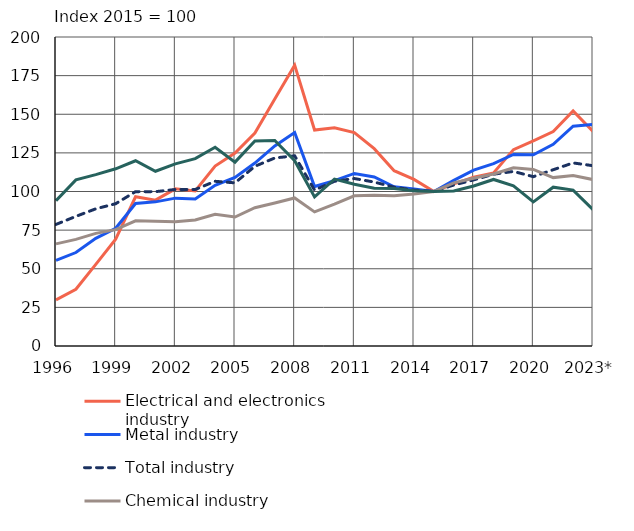
| Category | Electrical and electronics industry | Metal industry | Total industry | Chemical industry  | Forest industry |
|---|---|---|---|---|---|
| 1996 | 29.9 | 55.4 | 78.7 | 66.1 | 94.1 |
| 1997 | 36.7 | 60.5 | 83.9 | 69 | 107.5 |
| 1998 | 52.8 | 69.7 | 88.8 | 72.9 | 110.9 |
| 1999 | 69.2 | 76.2 | 92.1 | 75.3 | 114.7 |
| 2000 | 96.6 | 92.2 | 99.9 | 81 | 119.9 |
| 2001 | 94.4 | 93.3 | 99.9 | 80.7 | 113.1 |
| 2002 | 101.7 | 95.7 | 101.3 | 80.4 | 117.9 |
| 2003 | 100.4 | 95.1 | 101.3 | 81.6 | 121.3 |
| 2004 | 116.5 | 104 | 106.6 | 85.3 | 128.6 |
| 2005 | 124.9 | 109.1 | 105.6 | 83.5 | 119 |
| 2006 | 137.8 | 118.4 | 116.3 | 89.5 | 132.7 |
| 2007 | 159.8 | 129.5 | 121.7 | 92.6 | 133 |
| 2008 | 181.8 | 138.2 | 123.1 | 95.8 | 119.9 |
| 2009 | 139.8 | 103.2 | 100.9 | 86.8 | 96.5 |
| 2010 | 141.2 | 107 | 106.6 | 91.8 | 108 |
| 2011 | 138.1 | 111.7 | 108.4 | 97.2 | 104.7 |
| 2012 | 127.7 | 109.4 | 106.1 | 97.5 | 102.1 |
| 2013 | 113.5 | 103 | 102.8 | 97.2 | 102 |
| 2014 | 107.8 | 101.6 | 100.9 | 98.4 | 100.5 |
| 2015 | 100 | 100 | 100 | 100 | 100 |
| 2016 | 104.9 | 107.2 | 104.2 | 105.6 | 100.4 |
| 2017 | 109.2 | 113.8 | 107.5 | 108.6 | 103.6 |
| 2018 | 112 | 118 | 111.2 | 111.3 | 107.8 |
| 2019 | 127.1 | 124 | 113 | 115.4 | 103.7 |
| 2020 | 132.8 | 123.8 | 109.6 | 114.3 | 93.3 |
| 2021 | 138.8 | 130.5 | 114.1 | 109 | 102.8 |
| 2022 | 152.1 | 142.3 | 118.5 | 110.4 | 100.9 |
| 2023* | 138.9 | 143.5 | 116.7 | 107.7 | 88.3 |